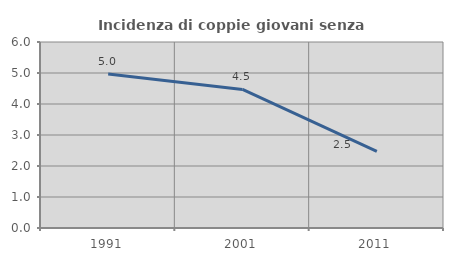
| Category | Incidenza di coppie giovani senza figli |
|---|---|
| 1991.0 | 4.968 |
| 2001.0 | 4.47 |
| 2011.0 | 2.469 |